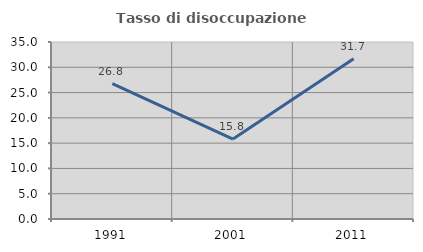
| Category | Tasso di disoccupazione giovanile  |
|---|---|
| 1991.0 | 26.781 |
| 2001.0 | 15.816 |
| 2011.0 | 31.707 |